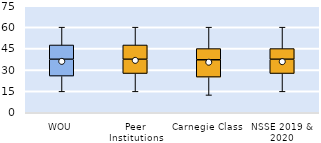
| Category | 25th | 50th | 75th |
|---|---|---|---|
| WOU | 25.714 | 11.786 | 10 |
| Peer Institutions | 27.5 | 10 | 10 |
| Carnegie Class | 25 | 12.143 | 7.857 |
| NSSE 2019 & 2020 | 27.5 | 10 | 7.5 |